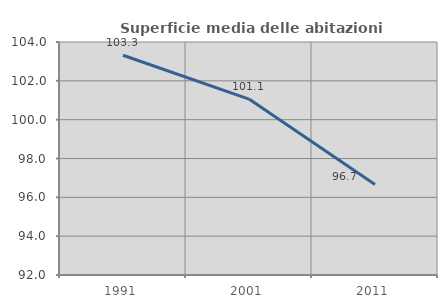
| Category | Superficie media delle abitazioni occupate |
|---|---|
| 1991.0 | 103.318 |
| 2001.0 | 101.062 |
| 2011.0 | 96.664 |